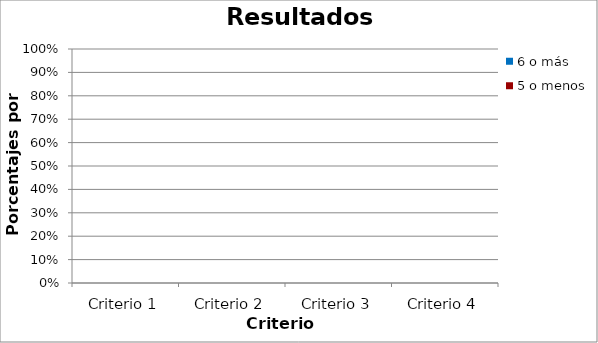
| Category | 6 o más | 5 o menos |
|---|---|---|
| Criterio 1 | 0 | 0 |
| Criterio 2 | 0 | 0 |
| Criterio 3 | 0 | 0 |
| Criterio 4 | 0 | 0 |